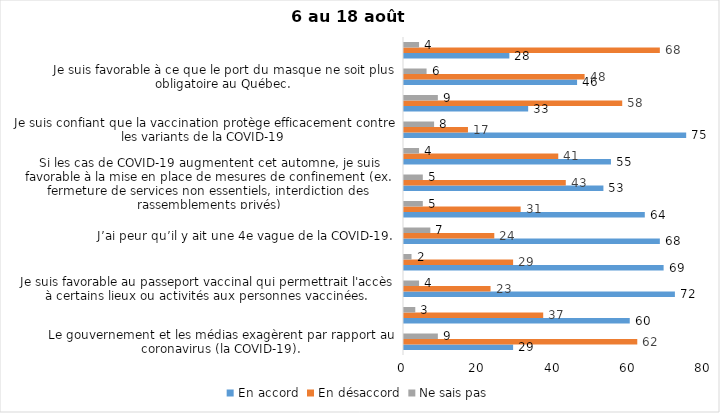
| Category | En accord | En désaccord | Ne sais pas |
|---|---|---|---|
| Le gouvernement et les médias exagèrent par rapport au coronavirus (la COVID-19). | 29 | 62 | 9 |
| J’ai peur que le système de santé soit débordé par les cas de COVID-19 suite au "déconfinement" | 60 | 37 | 3 |
| Je suis favorable au passeport vaccinal qui permettrait l'accès à certains lieux ou activités aux personnes vaccinées. | 72 | 23 | 4 |
| Malgré la levée des mesures de confinement, je préfère limiter mes contacts avec d’autres personnes (par ex., en évitant les activités sociales et de groupes) | 69 | 29 | 2 |
| J’ai peur qu’il y ait une 4e vague de la COVID-19. | 68 | 24 | 7 |
| Dans les régions en zone verte, le risque d’attraper la COVID-19 est minime. | 64 | 31 | 5 |
| Si les cas de COVID-19 augmentent cet automne, je suis favorable à la mise en place de mesures de confinement (ex. fermeture de services non essentiels, interdiction des rassemblements privés) | 53 | 43 | 5 |
| Je suis inquiet de contracter le variant Delta de la Covid-19 | 55 | 41 | 4 |
| Je suis confiant que la vaccination protège efficacement contre les variants de la COVID-19 | 75 | 17 | 8 |
| En raison de la baisse des cas de COID-19 je pense que le gouvernement du Québec devrait mettre fin à l’état d’urgence sanitaire | 33 | 58 | 9 |
| Je suis favorable à ce que le port du masque ne soit plus obligatoire au Québec. | 46 | 48 | 6 |
| Étant donné la progression de la vaccination, je pense qu’il est moins important de suivre les mesures de prévention. | 28 | 68 | 4 |